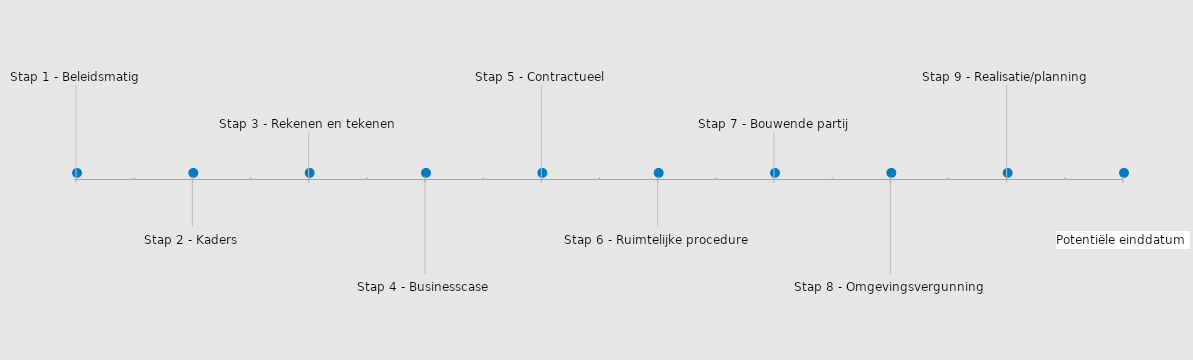
| Category | POSITIE |
|---|---|
| Stap 1 - Beleidsmatig | 20 |
| Stap 2 - Kaders | -10 |
| Stap 3 - Rekenen en tekenen | 10 |
| Stap 4 - Businesscase | -20 |
| Stap 5 - Contractueel | 20 |
| Stap 6 - Ruimtelijke procedure | -10 |
| Stap 7 - Bouwende partij | 10 |
| Stap 8 - Omgevingsvergunning | -20 |
| Stap 9 - Realisatie/planning | 20 |
| Potentiële einddatum | -10 |